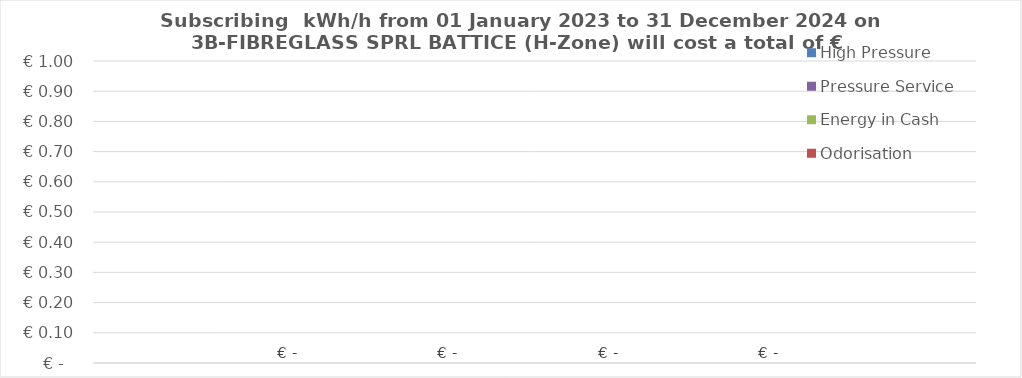
| Category | High Pressure | Pressure Service | Energy in Cash  | Odorisation |
|---|---|---|---|---|
|  | 0 | 0 | 0 | 0 |